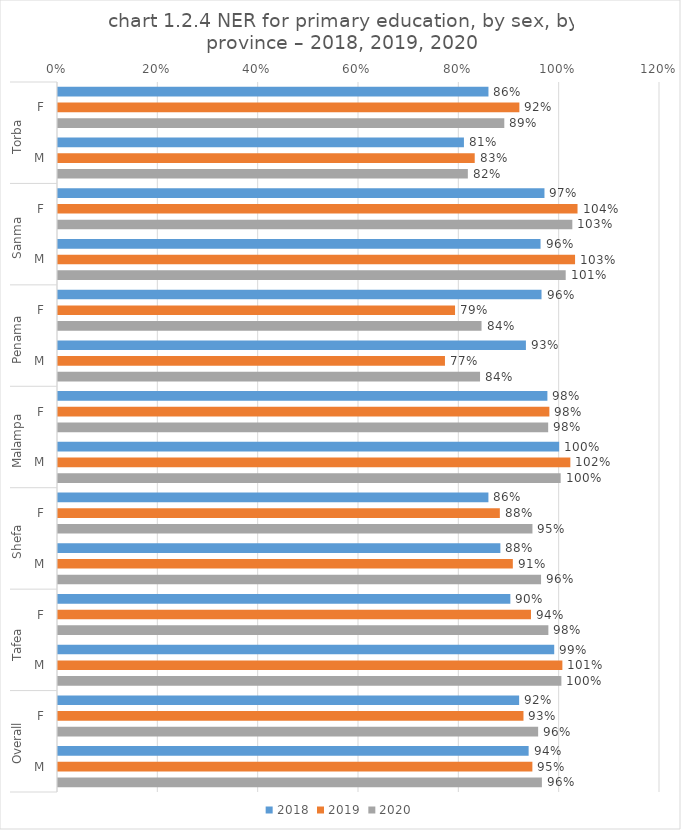
| Category | 2018 | 2019 | 2020 |
|---|---|---|---|
| 0 | 0.858 | 0.92 | 0.89 |
| 1 | 0.809 | 0.831 | 0.817 |
| 2 | 0.97 | 1.036 | 1.025 |
| 3 | 0.962 | 1.031 | 1.012 |
| 4 | 0.964 | 0.791 | 0.844 |
| 5 | 0.933 | 0.771 | 0.841 |
| 6 | 0.976 | 0.979 | 0.977 |
| 7 | 0.999 | 1.021 | 1.002 |
| 8 | 0.858 | 0.881 | 0.946 |
| 9 | 0.882 | 0.907 | 0.963 |
| 10 | 0.902 | 0.943 | 0.977 |
| 11 | 0.989 | 1.005 | 1.003 |
| 12 | 0.919 | 0.928 | 0.957 |
| 13 | 0.938 | 0.946 | 0.965 |